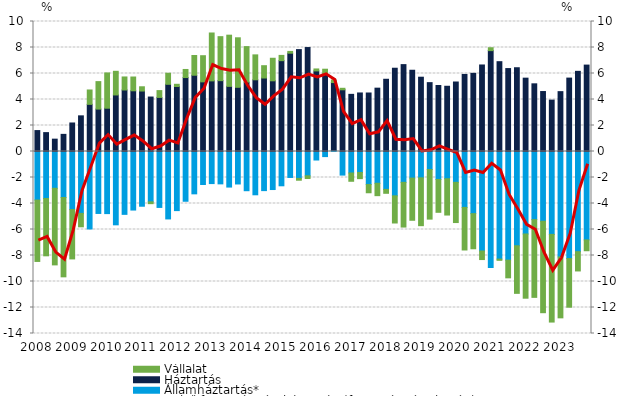
| Category | Államháztartás* | Háztartás | Vállalat |
|---|---|---|---|
| 2008.0 | -3.735 | 1.61 | -4.722 |
| nan | -3.615 | 1.453 | -4.409 |
| nan | -2.831 | 0.949 | -5.891 |
| nan | -3.539 | 1.318 | -6.102 |
| 2009.0 | -4.467 | 2.194 | -3.796 |
| nan | -4.761 | 2.742 | -1.033 |
| nan | -5.958 | 3.627 | 1.106 |
| nan | -4.765 | 3.263 | 2.113 |
| 2010.0 | -4.778 | 3.33 | 2.714 |
| nan | -5.641 | 4.349 | 1.819 |
| nan | -4.835 | 4.732 | 1.002 |
| nan | -4.504 | 4.67 | 1.06 |
| 2011.0 | -4.21 | 4.651 | 0.328 |
| nan | -3.873 | 4.189 | -0.139 |
| nan | -4.302 | 4.16 | 0.525 |
| nan | -5.187 | 5.168 | 0.851 |
| 2012.0 | -4.547 | 4.999 | 0.17 |
| nan | -3.828 | 5.688 | 0.622 |
| nan | -3.257 | 5.866 | 1.517 |
| nan | -2.538 | 5.357 | 2.012 |
| 2013.0 | -2.468 | 5.433 | 3.683 |
| nan | -2.49 | 5.449 | 3.384 |
| nan | -2.736 | 5.011 | 3.937 |
| nan | -2.498 | 4.939 | 3.808 |
| 2014.0 | -3.016 | 5.335 | 2.734 |
| nan | -3.33 | 5.516 | 1.917 |
| nan | -3.009 | 5.654 | 0.947 |
| nan | -2.926 | 5.438 | 1.734 |
| 2015.0 | -2.638 | 6.988 | 0.405 |
| nan | -1.997 | 7.561 | 0.138 |
| nan | -2.069 | 7.838 | -0.14 |
| nan | -1.87 | 7.996 | -0.208 |
| 2016.0 | -0.655 | 6.199 | 0.15 |
| nan | -0.393 | 5.969 | 0.361 |
| nan | 0.088 | 5.216 | 0.194 |
| nan | -1.815 | 4.746 | 0.116 |
| 2017.0 | -1.653 | 4.396 | -0.637 |
| nan | -1.614 | 4.503 | -0.475 |
| nan | -2.541 | 4.5 | -0.633 |
| nan | -2.444 | 4.872 | -0.952 |
| 2018.0 | -2.915 | 5.556 | -0.3 |
| nan | -3.411 | 6.405 | -2.089 |
| nan | -2.373 | 6.683 | -3.439 |
| nan | -2.046 | 6.25 | -3.244 |
| 2019.0 | -2.027 | 5.715 | -3.679 |
| nan | -1.388 | 5.297 | -3.814 |
| nan | -2.149 | 5.079 | -2.528 |
| nan | -2.098 | 5.018 | -2.789 |
| 2020.0 | -2.373 | 5.346 | -3.092 |
| nan | -4.302 | 5.928 | -3.274 |
| nan | -4.78 | 6.011 | -2.703 |
| nan | -7.655 | 6.656 | -0.657 |
| 2021.0 | -8.922 | 7.76 | 0.222 |
| nan | -8.276 | 6.909 | -0.095 |
| nan | -8.357 | 6.38 | -1.362 |
| nan | -7.252 | 6.443 | -3.66 |
| 2022.0 | -6.346 | 5.641 | -4.939 |
| nan | -5.241 | 5.206 | -5.979 |
| nan | -5.367 | 4.612 | -7.033 |
| nan | -6.376 | 3.951 | -6.744 |
| 2023.0 | -8.111 | 4.605 | -4.685 |
| nan | -8.235 | 5.647 | -3.743 |
| nan | -7.707 | 6.166 | -1.482 |
| nan | -6.803 | 6.647 | -0.83 |